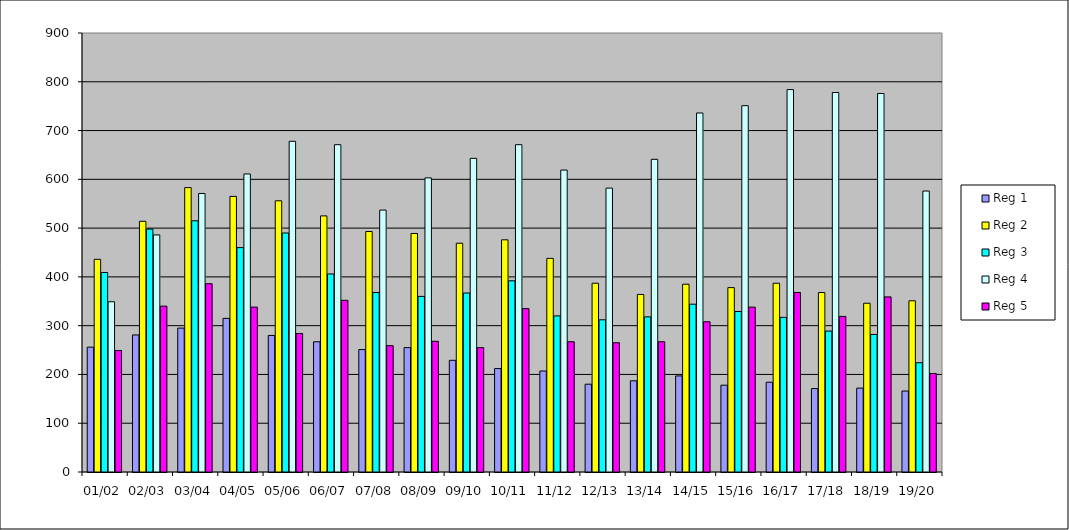
| Category | Reg 1 | Reg 2 | Reg 3 | Reg 4 | Reg 5 |
|---|---|---|---|---|---|
| 01/02 | 256 | 436 | 409 | 349 | 249 |
| 02/03 | 281 | 514 | 498 | 486 | 340 |
| 03/04 | 295 | 583 | 515 | 571 | 386 |
| 04/05 | 315 | 565 | 460 | 611 | 338 |
| 05/06 | 280 | 556 | 490 | 678 | 284 |
| 06/07 | 267 | 525 | 406 | 671 | 352 |
| 07/08 | 251 | 493 | 368 | 537 | 259 |
| 08/09 | 255 | 489 | 360 | 603 | 268 |
| 09/10 | 229 | 469 | 367 | 643 | 255 |
| 10/11 | 212 | 476 | 392 | 671 | 335 |
| 11/12 | 207 | 438 | 320 | 619 | 267 |
| 12/13 | 180 | 387 | 312 | 582 | 265 |
| 13/14 | 187 | 364 | 318 | 641 | 267 |
| 14/15 | 197 | 385 | 344 | 736 | 308 |
| 15/16 | 178 | 378 | 329 | 751 | 338 |
| 16/17 | 184 | 387 | 317 | 784 | 368 |
| 17/18 | 171 | 368 | 289 | 778 | 319 |
| 18/19 | 172 | 346 | 282 | 776 | 359 |
| 19/20 | 166 | 351 | 224 | 576 | 202 |